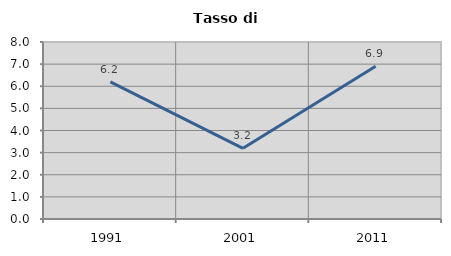
| Category | Tasso di disoccupazione   |
|---|---|
| 1991.0 | 6.2 |
| 2001.0 | 3.196 |
| 2011.0 | 6.908 |